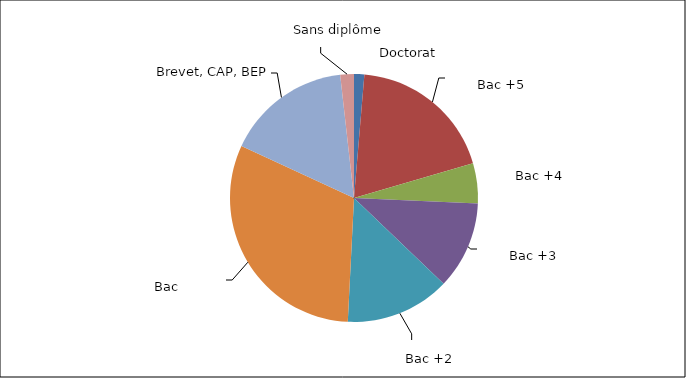
| Category | Hors Education nationale et enseignement supérieur |
|---|---|
| Doctorat  | 0.013 |
| Bac +5 | 0.191 |
| Bac +4 | 0.053 |
| Bac +3 | 0.114 |
| Bac +2 | 0.137 |
| Bac | 0.311 |
| Brevet, CAP, BEP | 0.163 |
| Sans diplôme | 0.018 |